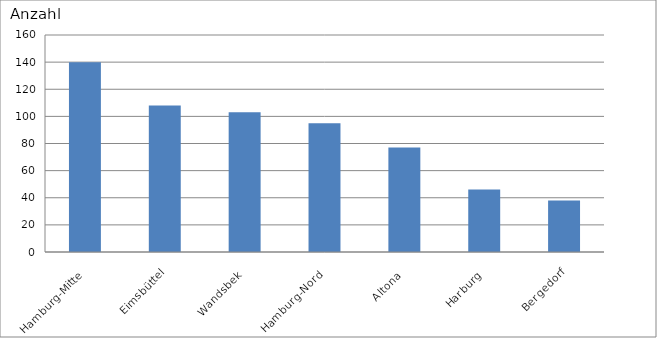
| Category | Hamburg-Mitte Eimsbüttel Wandsbek Hamburg-Nord Altona Harburg Bergedorf |
|---|---|
| Hamburg-Mitte | 140 |
| Eimsbüttel | 108 |
| Wandsbek | 103 |
| Hamburg-Nord | 95 |
| Altona | 77 |
| Harburg | 46 |
| Bergedorf | 38 |